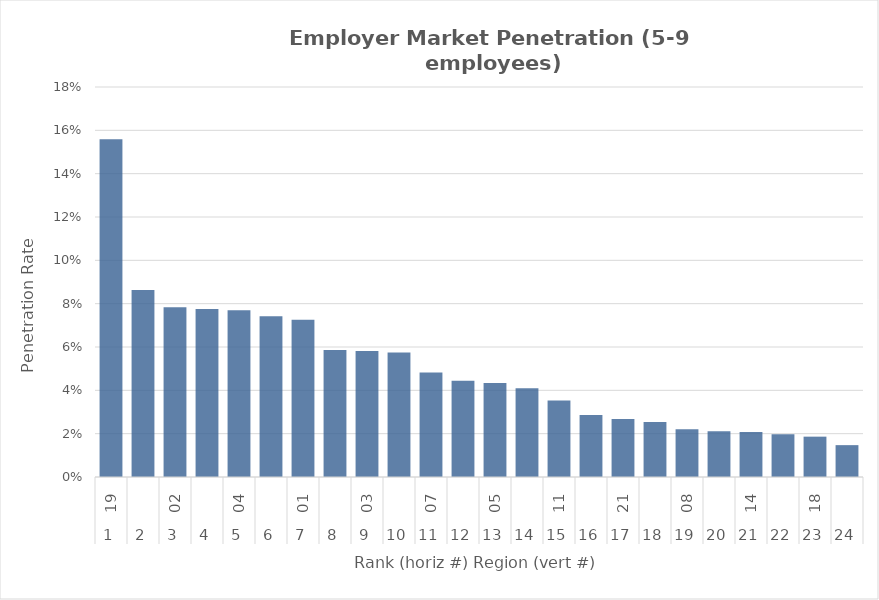
| Category | Rate |
|---|---|
| 0 | 0.156 |
| 1 | 0.086 |
| 2 | 0.078 |
| 3 | 0.078 |
| 4 | 0.077 |
| 5 | 0.074 |
| 6 | 0.073 |
| 7 | 0.059 |
| 8 | 0.058 |
| 9 | 0.057 |
| 10 | 0.048 |
| 11 | 0.044 |
| 12 | 0.043 |
| 13 | 0.041 |
| 14 | 0.035 |
| 15 | 0.029 |
| 16 | 0.027 |
| 17 | 0.025 |
| 18 | 0.022 |
| 19 | 0.021 |
| 20 | 0.021 |
| 21 | 0.02 |
| 22 | 0.019 |
| 23 | 0.015 |